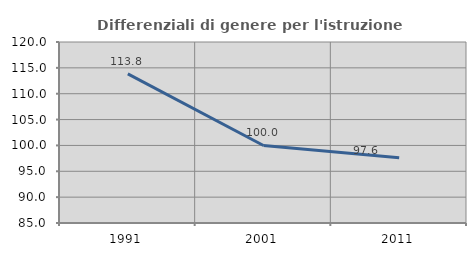
| Category | Differenziali di genere per l'istruzione superiore |
|---|---|
| 1991.0 | 113.827 |
| 2001.0 | 99.988 |
| 2011.0 | 97.634 |